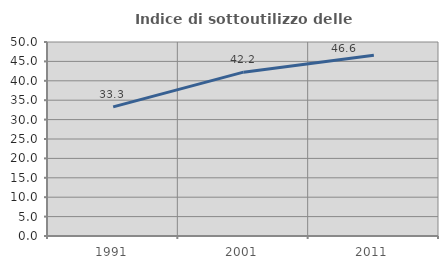
| Category | Indice di sottoutilizzo delle abitazioni  |
|---|---|
| 1991.0 | 33.29 |
| 2001.0 | 42.232 |
| 2011.0 | 46.579 |